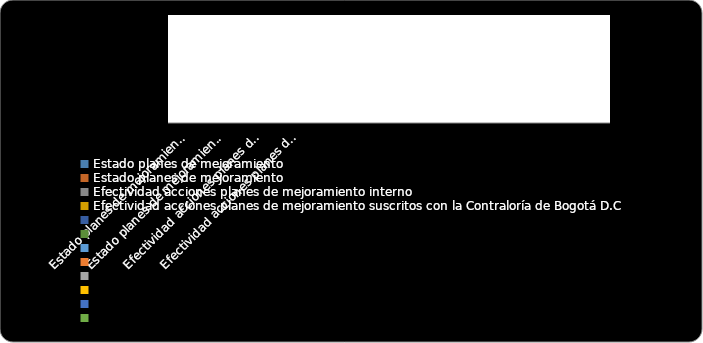
| Category | % Cumplimiento  |
|---|---|
| Estado planes de mejoramiento  | 0 |
| Estado planes de mejoramiento  | 0 |
| Efectividad acciones planes de mejoramiento interno | 0 |
| Efectividad acciones planes de mejoramiento suscritos con la Contraloría de Bogotá D.C  | 0 |